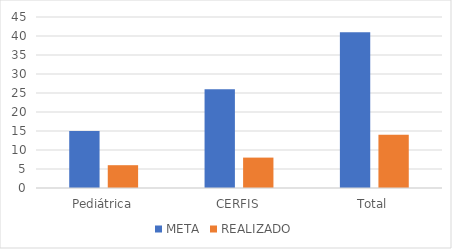
| Category | META | REALIZADO |
|---|---|---|
| Pediátrica | 15 | 6 |
| CERFIS | 26 | 8 |
| Total | 41 | 14 |